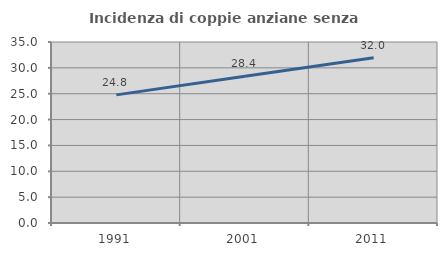
| Category | Incidenza di coppie anziane senza figli  |
|---|---|
| 1991.0 | 24.773 |
| 2001.0 | 28.395 |
| 2011.0 | 31.97 |